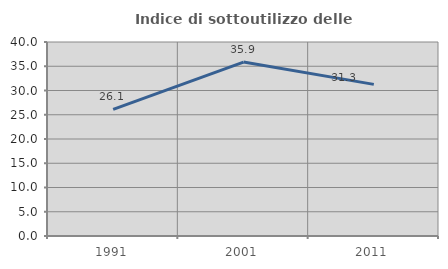
| Category | Indice di sottoutilizzo delle abitazioni  |
|---|---|
| 1991.0 | 26.109 |
| 2001.0 | 35.858 |
| 2011.0 | 31.266 |